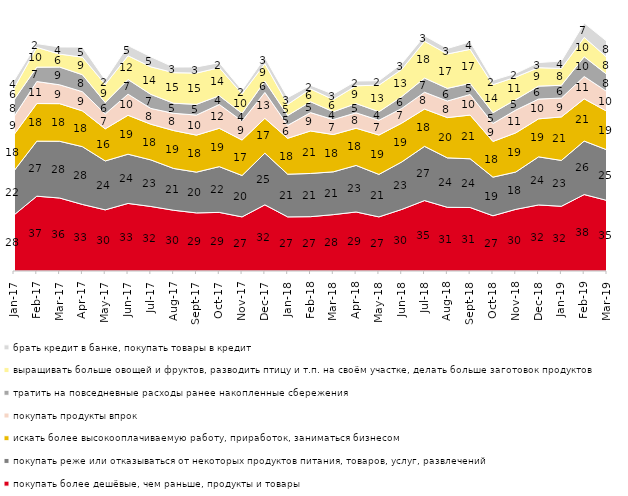
| Category | покупать более дешёвые, чем раньше, продукты и товары | покупать реже или отказываться от некоторых продуктов питания, товаров, услуг, развлечений | искать более высокооплачиваемую работу, приработок, заниматься бизнесом | покупать продукты впрок | тратить на повседневные расходы ранее накопленные сбережения | выращивать больше овощей и фруктов, разводить птицу и т.п. на своём участке, делать больше заготовок продуктов  | брать кредит в банке, покупать товары в кредит |
|---|---|---|---|---|---|---|---|
| 2017-01-01 | 27.5 | 21.65 | 17.8 | 8.85 | 8.15 | 5.7 | 3.75 |
| 2017-02-01 | 36.7 | 27 | 18.45 | 10.8 | 7.05 | 9.7 | 1.85 |
| 2017-03-01 | 35.8 | 27.85 | 18.45 | 9.25 | 8.7 | 6.35 | 3.5 |
| 2017-04-01 | 32.65 | 28.35 | 17.55 | 9.4 | 8.35 | 8.6 | 4.95 |
| 2017-05-01 | 30 | 24 | 15.75 | 7.3 | 5.6 | 8.9 | 2.2 |
| 2017-06-01 | 33.15 | 24.15 | 19.1 | 10.35 | 7.2 | 11.65 | 5 |
| 2017-07-01 | 31.65 | 22.85 | 17.5 | 7.75 | 6.9 | 13.5 | 4.95 |
| 2017-08-01 | 29.8 | 20.5 | 18.6 | 8.45 | 4.95 | 15 | 2.75 |
| 2017-09-01 | 28.5 | 20 | 18.15 | 9.85 | 5.25 | 15.35 | 3 |
| 2017-10-01 | 28.75 | 22.45 | 18.8 | 11.7 | 4.3 | 13.75 | 2.45 |
| 2017-11-01 | 26.55 | 20.3 | 17.4 | 9.3 | 3.8 | 9.6 | 1.7 |
| 2017-12-01 | 32.45 | 25.35 | 17.1 | 12.7 | 5.55 | 8.55 | 3.05 |
| 2018-01-01 | 26.55 | 20.95 | 17.6 | 6.35 | 4.85 | 5.45 | 3.3 |
| 2018-02-01 | 26.65 | 21.2 | 20.85 | 9 | 5.35 | 6.25 | 1.85 |
| 2018-03-01 | 27.65 | 21 | 18.3 | 7.35 | 3.85 | 5.95 | 2.65 |
| 2018-04-01 | 28.95 | 22.85 | 18.25 | 7.55 | 4.55 | 8.7 | 2.35 |
| 2018-05-01 | 26.55 | 20.85 | 19.3 | 7.25 | 4.2 | 13.05 | 2.15 |
| 2018-06-01 | 30.2 | 23.3 | 19.05 | 7.2 | 5.8 | 13.35 | 2.8 |
| 2018-07-01 | 34.55 | 26.6 | 18.3 | 8.25 | 6.95 | 18.05 | 2.75 |
| 2018-08-01 | 31.25 | 24.25 | 19.75 | 8.15 | 6.2 | 16.85 | 2.7 |
| 2018-09-01 | 31.15 | 23.9 | 21.45 | 10.1 | 5.45 | 16.7 | 3.7 |
| 2018-10-01 | 27.1 | 18.95 | 17.5 | 8.8 | 5.3 | 13.75 | 2.2 |
| 2018-11-01 | 30.24 | 18.313 | 19.212 | 11.178 | 5.14 | 11.078 | 1.796 |
| 2018-12-01 | 32.4 | 23.6 | 18.65 | 9.7 | 6.35 | 9.05 | 2.5 |
| 2019-01-01 | 31.75 | 22.5 | 21.35 | 9.25 | 6.25 | 8.25 | 3.65 |
| 2019-02-01 | 37.5 | 26.25 | 20.7 | 10.95 | 9.7 | 9.5 | 7.05 |
| 2019-03-01 | 34.61 | 24.814 | 18.896 | 9.697 | 8.404 | 8.354 | 7.857 |